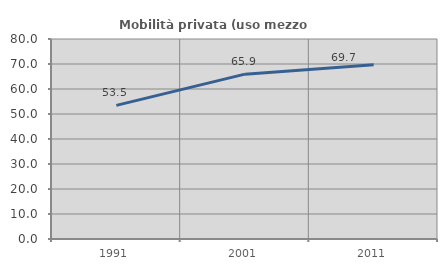
| Category | Mobilità privata (uso mezzo privato) |
|---|---|
| 1991.0 | 53.463 |
| 2001.0 | 65.944 |
| 2011.0 | 69.737 |